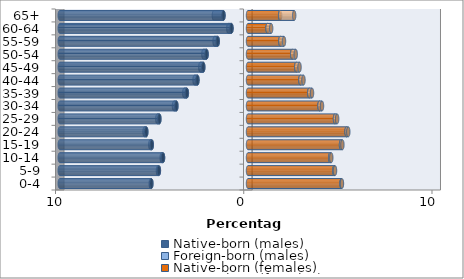
| Category | Native-born (males) | Foreign-born (males) | Native-born (females) | Foreign-born (females) |
|---|---|---|---|---|
| 0-4 | -5.134 | -0.032 | 4.966 | 0.024 |
| 5-9 | -4.734 | -0.05 | 4.583 | 0.04 |
| 10-14 | -4.514 | -0.068 | 4.366 | 0.058 |
| 15-19 | -5.111 | -0.08 | 4.942 | 0.073 |
| 20-24 | -5.402 | -0.093 | 5.236 | 0.092 |
| 25-29 | -4.708 | -0.11 | 4.621 | 0.114 |
| 30-34 | -3.804 | -0.128 | 3.796 | 0.135 |
| 35-39 | -3.247 | -0.139 | 3.252 | 0.149 |
| 40-44 | -2.686 | -0.154 | 2.781 | 0.166 |
| 45-49 | -2.376 | -0.16 | 2.563 | 0.174 |
| 50-54 | -2.201 | -0.17 | 2.348 | 0.187 |
| 55-59 | -1.609 | -0.167 | 1.718 | 0.195 |
| 60-64 | -0.878 | -0.169 | 1.037 | 0.193 |
| 65+ | -1.303 | -0.51 | 1.708 | 0.745 |